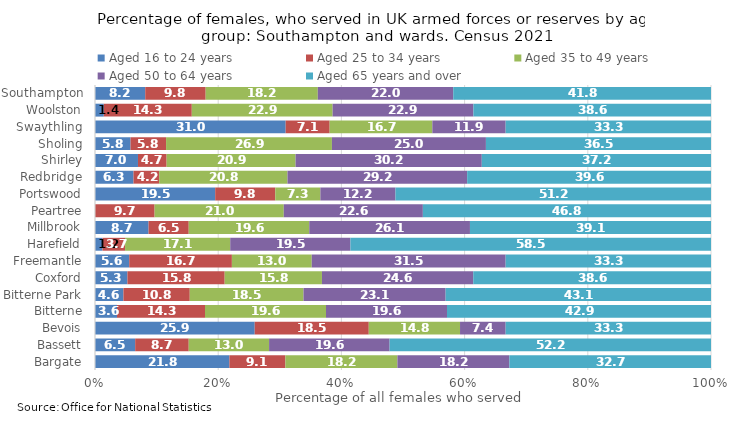
| Category | Aged 16 to 24 years | Aged 25 to 34 years | Aged 35 to 49 years | Aged 50 to 64 years | Aged 65 years and over |
|---|---|---|---|---|---|
| Bargate | 21.818 | 9.091 | 18.182 | 18.182 | 32.727 |
| Bassett | 6.522 | 8.696 | 13.043 | 19.565 | 52.174 |
| Bevois | 25.926 | 18.519 | 14.815 | 7.407 | 33.333 |
| Bitterne | 3.571 | 14.286 | 19.643 | 19.643 | 42.857 |
| Bitterne Park | 4.615 | 10.769 | 18.462 | 23.077 | 43.077 |
| Coxford | 5.263 | 15.789 | 15.789 | 24.561 | 38.596 |
| Freemantle | 5.556 | 16.667 | 12.963 | 31.481 | 33.333 |
| Harefield | 1.22 | 3.659 | 17.073 | 19.512 | 58.537 |
| Millbrook | 8.696 | 6.522 | 19.565 | 26.087 | 39.13 |
| Peartree | 0 | 9.677 | 20.968 | 22.581 | 46.774 |
| Portswood | 19.512 | 9.756 | 7.317 | 12.195 | 51.22 |
| Redbridge | 6.25 | 4.167 | 20.833 | 29.167 | 39.583 |
| Shirley | 6.977 | 4.651 | 20.93 | 30.233 | 37.209 |
| Sholing | 5.769 | 5.769 | 26.923 | 25 | 36.538 |
| Swaythling | 30.952 | 7.143 | 16.667 | 11.905 | 33.333 |
| Woolston | 1.429 | 14.286 | 22.857 | 22.857 | 38.571 |
| Southampton | 8.156 | 9.811 | 18.203 | 21.986 | 41.844 |